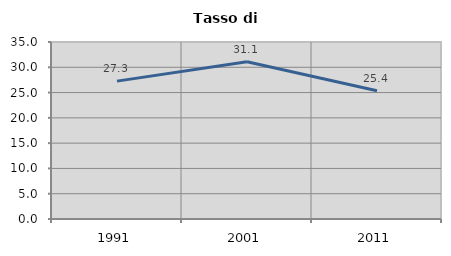
| Category | Tasso di disoccupazione   |
|---|---|
| 1991.0 | 27.261 |
| 2001.0 | 31.082 |
| 2011.0 | 25.355 |